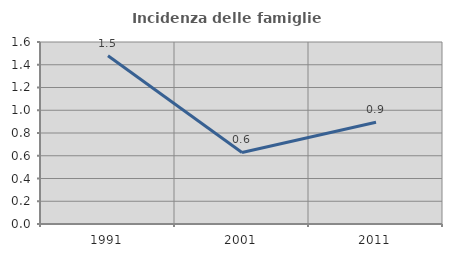
| Category | Incidenza delle famiglie numerose |
|---|---|
| 1991.0 | 1.479 |
| 2001.0 | 0.629 |
| 2011.0 | 0.895 |